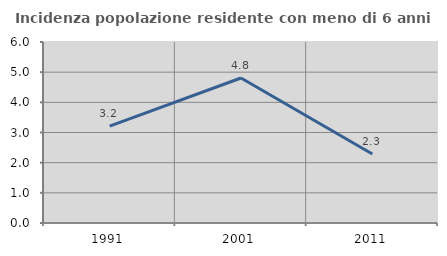
| Category | Incidenza popolazione residente con meno di 6 anni |
|---|---|
| 1991.0 | 3.214 |
| 2001.0 | 4.808 |
| 2011.0 | 2.288 |